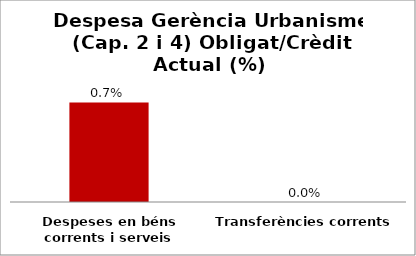
| Category | Series 0 |
|---|---|
| Despeses en béns corrents i serveis | 0.007 |
| Transferències corrents | 0 |